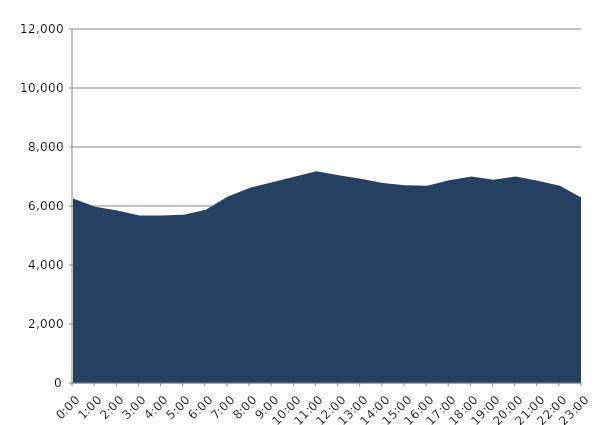
| Category | Series 0 | Series 1 |
|---|---|---|
| 2018-08-15 |  | 6254.51 |
| 2018-08-15 01:00:00 |  | 5970.88 |
| 2018-08-15 02:00:00 |  | 5846.46 |
| 2018-08-15 03:00:00 |  | 5679.47 |
| 2018-08-15 04:00:00 |  | 5676.04 |
| 2018-08-15 05:00:00 |  | 5705.93 |
| 2018-08-15 06:00:00 |  | 5869.24 |
| 2018-08-15 07:00:00 |  | 6321.4 |
| 2018-08-15 08:00:00 |  | 6620.01 |
| 2018-08-15 09:00:00 |  | 6807.18 |
| 2018-08-15 10:00:00 |  | 6995.08 |
| 2018-08-15 11:00:00 |  | 7177.93 |
| 2018-08-15 12:00:00 |  | 7041.97 |
| 2018-08-15 13:00:00 |  | 6920.02 |
| 2018-08-15 14:00:00 |  | 6783.03 |
| 2018-08-15 15:00:00 |  | 6703.33 |
| 2018-08-15 16:00:00 |  | 6687.93 |
| 2018-08-15 17:00:00 |  | 6869.4 |
| 2018-08-15 18:00:00 |  | 6998.17 |
| 2018-08-15 19:00:00 |  | 6888.13 |
| 2018-08-15 20:00:00 |  | 6998.57 |
| 2018-08-15 21:00:00 |  | 6856.93 |
| 2018-08-15 22:00:00 |  | 6685.67 |
| 2018-08-15 23:00:00 |  | 6270.01 |